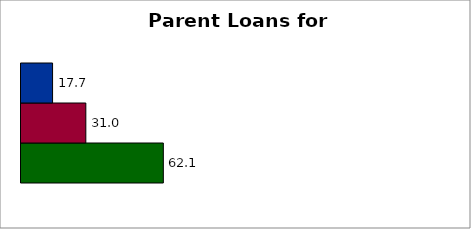
| Category | State | SREB states | 50 states and D.C. |
|---|---|---|---|
| 0 | 62.064 | 30.995 | 17.654 |